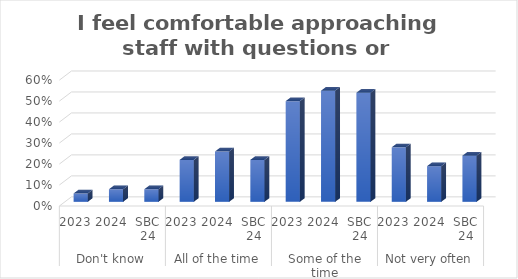
| Category |  I feel comfortable approaching staff with questions or suggestions. |
|---|---|
| 0 | 0.04 |
| 1 | 0.06 |
| 2 | 0.06 |
| 3 | 0.2 |
| 4 | 0.24 |
| 5 | 0.2 |
| 6 | 0.48 |
| 7 | 0.53 |
| 8 | 0.52 |
| 9 | 0.26 |
| 10 | 0.17 |
| 11 | 0.22 |